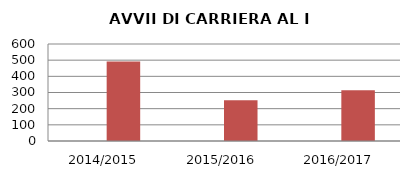
| Category | ANNO | NUMERO |
|---|---|---|
| 2014/2015 | 0 | 491 |
| 2015/2016 | 0 | 252 |
| 2016/2017 | 0 | 314 |